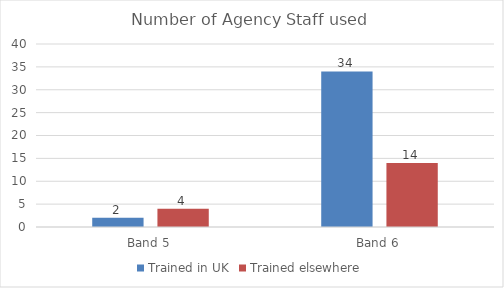
| Category | Trained in UK | Trained elsewhere |
|---|---|---|
| Band 5 | 2 | 4 |
| Band 6 | 34 | 14 |